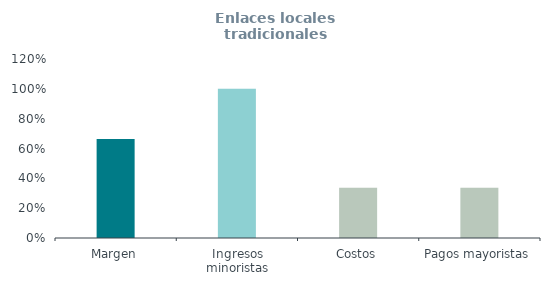
| Category | Enlaces locales tradicionales
(% ingresos) |
|---|---|
| Margen | 0.663 |
| Ingresos minoristas | 1 |
| Costos | 0.337 |
| Pagos mayoristas | 0.337 |